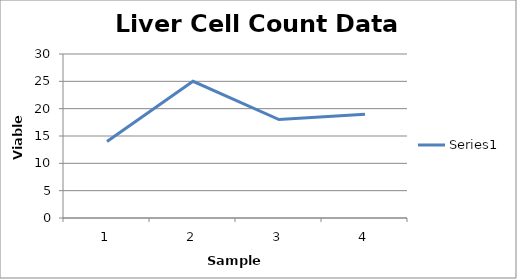
| Category | Series 0 |
|---|---|
| 0 | 14 |
| 1 | 25 |
| 2 | 18 |
| 3 | 19 |